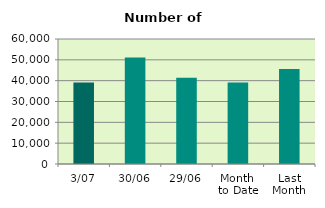
| Category | Series 0 |
|---|---|
| 3/07 | 39146 |
| 30/06 | 51106 |
| 29/06 | 41448 |
| Month 
to Date | 39146 |
| Last
Month | 45645.364 |